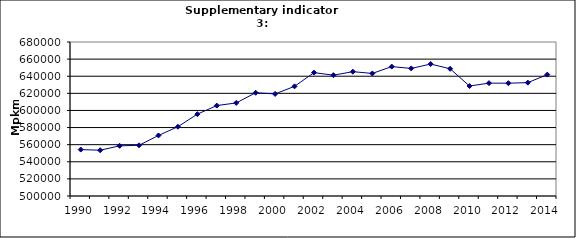
| Category | Passenger transport by cars, Mpkm |
|---|---|
| 1990 | 554245.458 |
| 1991 | 553506.082 |
| 1992 | 558626.906 |
| 1993 | 559251.704 |
| 1994 | 570785.106 |
| 1995 | 580990.494 |
| 1996 | 595673.807 |
| 1997 | 605680.771 |
| 1998 | 608815.468 |
| 1999 | 620699.456 |
| 2000 | 619326.435 |
| 2001 | 628169.97 |
| 2002 | 644212.469 |
| 2003 | 641225.947 |
| 2004 | 645324.324 |
| 2005 | 643251.645 |
| 2006 | 651258.275 |
| 2007 | 649108.438 |
| 2008 | 654228.536 |
| 2009 | 648679.898 |
| 2010 | 628535.854 |
| 2011 | 631924.368 |
| 2012 | 631851.026 |
| 2013 | 632525.693 |
| 2014 | 641859.733 |